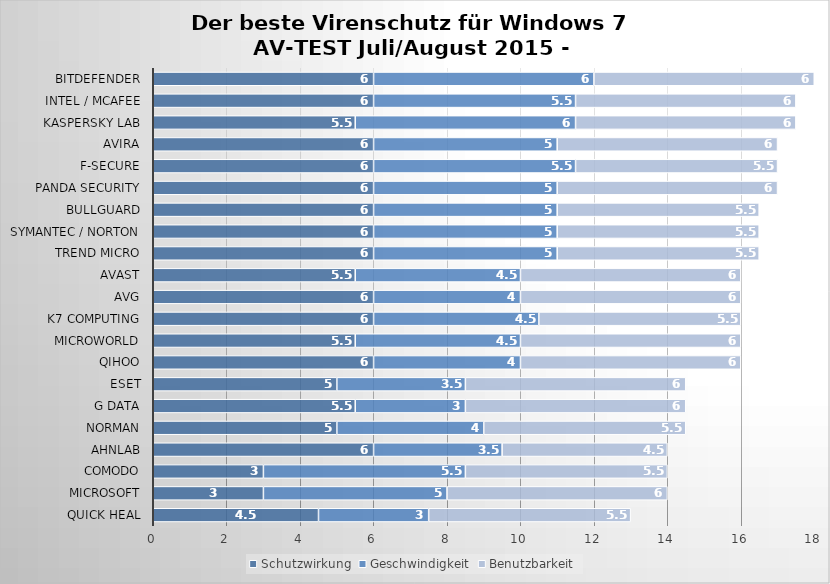
| Category | Schutzwirkung | Geschwindigkeit | Benutzbarkeit |
|---|---|---|---|
| Quick Heal | 4.5 | 3 | 5.5 |
| Microsoft | 3 | 5 | 6 |
| Comodo | 3 | 5.5 | 5.5 |
| AhnLab | 6 | 3.5 | 4.5 |
| Norman | 5 | 4 | 5.5 |
| G Data | 5.5 | 3 | 6 |
| ESET | 5 | 3.5 | 6 |
| Qihoo | 6 | 4 | 6 |
| Microworld | 5.5 | 4.5 | 6 |
| K7 Computing | 6 | 4.5 | 5.5 |
| AVG | 6 | 4 | 6 |
| Avast | 5.5 | 4.5 | 6 |
| Trend Micro | 6 | 5 | 5.5 |
| Symantec / Norton | 6 | 5 | 5.5 |
| BullGuard | 6 | 5 | 5.5 |
| Panda Security | 6 | 5 | 6 |
| F-Secure | 6 | 5.5 | 5.5 |
| Avira | 6 | 5 | 6 |
| Kaspersky Lab | 5.5 | 6 | 6 |
| Intel / McAfee | 6 | 5.5 | 6 |
| Bitdefender | 6 | 6 | 6 |